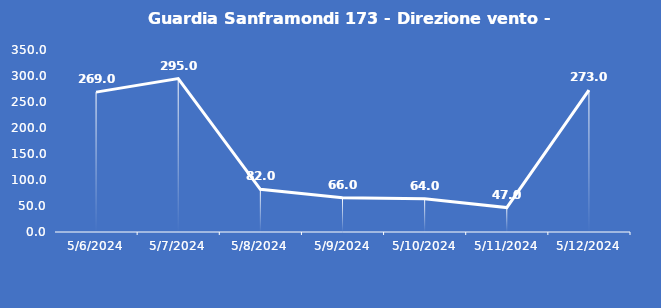
| Category | Guardia Sanframondi 173 - Direzione vento - Grezzo (°N) |
|---|---|
| 5/6/24 | 269 |
| 5/7/24 | 295 |
| 5/8/24 | 82 |
| 5/9/24 | 66 |
| 5/10/24 | 64 |
| 5/11/24 | 47 |
| 5/12/24 | 273 |